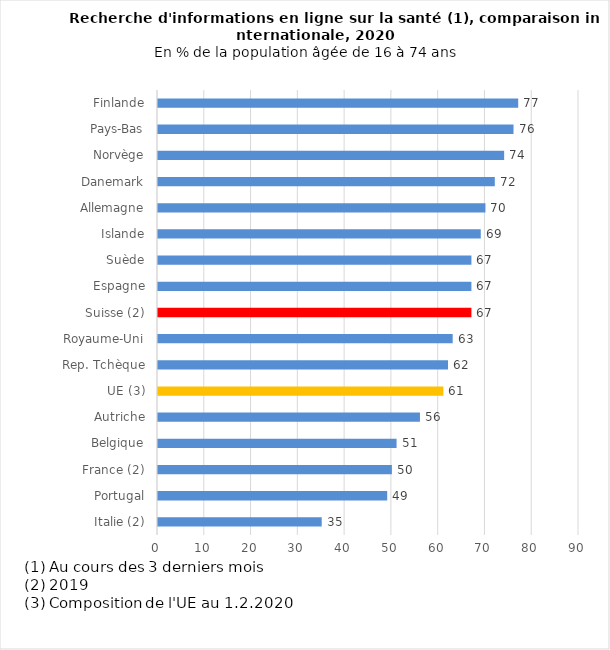
| Category | 2020 |
|---|---|
| Italie (2) | 35 |
| Portugal | 49 |
| France (2) | 50 |
| Belgique | 51 |
| Autriche | 56 |
| UE (3) | 61 |
| Rep. Tchèque | 62 |
| Royaume-Uni | 63 |
| Suisse (2) | 67 |
| Espagne | 67 |
| Suède | 67 |
| Islande | 69 |
| Allemagne | 70 |
| Danemark | 72 |
| Norvège | 74 |
| Pays-Bas | 76 |
| Finlande | 77 |